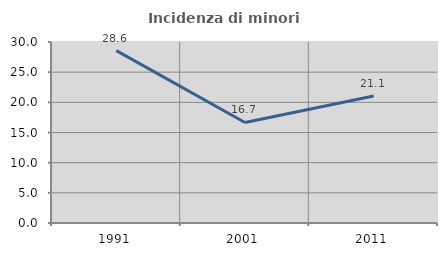
| Category | Incidenza di minori stranieri |
|---|---|
| 1991.0 | 28.571 |
| 2001.0 | 16.667 |
| 2011.0 | 21.053 |